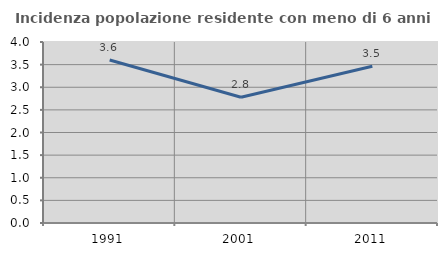
| Category | Incidenza popolazione residente con meno di 6 anni |
|---|---|
| 1991.0 | 3.603 |
| 2001.0 | 2.78 |
| 2011.0 | 3.465 |